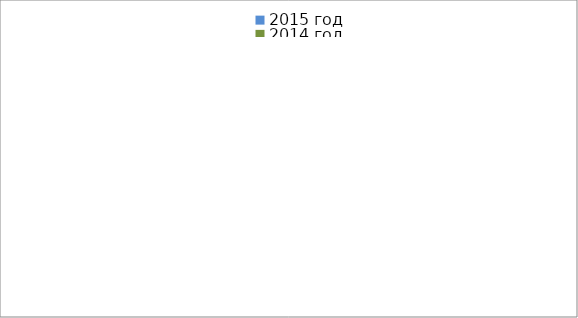
| Category | 2015 год | 2014 год |
|---|---|---|
|  - поджог | 14 | 11 |
|  - неосторожное обращение с огнём | 41 | 23 |
|  - НПТЭ электрооборудования | 7 | 12 |
|  - НПУ и Э печей | 37 | 45 |
|  - НПУ и Э транспортных средств | 35 | 42 |
|   -Шалость с огнем детей | 3 | 0 |
|  -НППБ при эксплуатации эл.приборов | 10 | 16 |
|  - курение | 17 | 16 |
| - прочие | 53 | 64 |
| - не установленные причины | 6 | 7 |